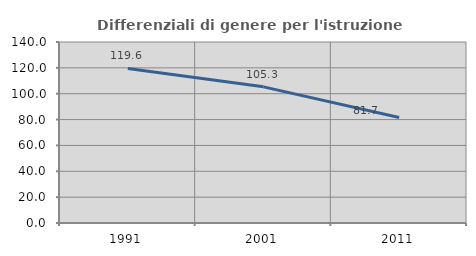
| Category | Differenziali di genere per l'istruzione superiore |
|---|---|
| 1991.0 | 119.565 |
| 2001.0 | 105.302 |
| 2011.0 | 81.656 |